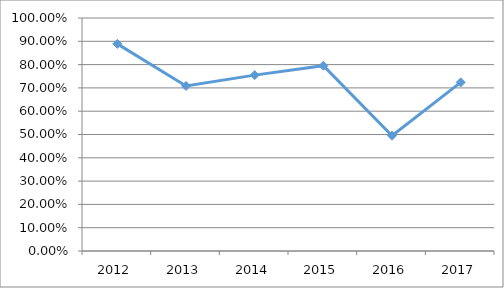
| Category | ENFL-M6O29 |
|---|---|
| 2012.0 | 0.889 |
| 2013.0 | 0.708 |
| 2014.0 | 0.755 |
| 2015.0 | 0.795 |
| 2016.0 | 0.495 |
| 2017.0 | 0.724 |